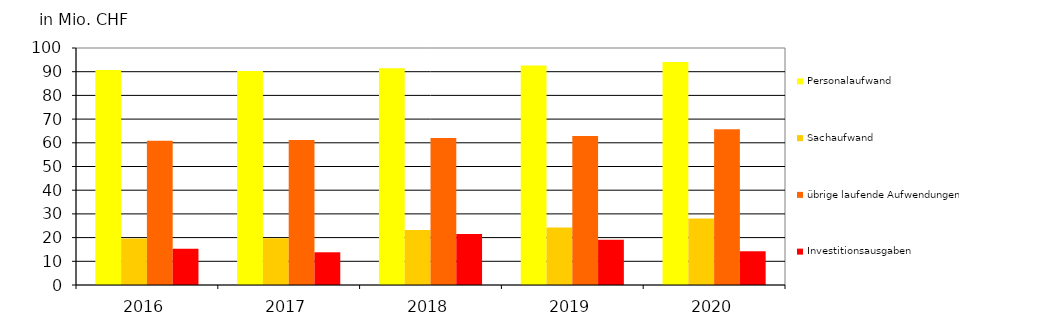
| Category | Personalaufwand
 | Sachaufwand
 | übrige laufende Aufwendungen | Investitionsausgaben
 |
|---|---|---|---|---|
| 2016.0 | 90.709 | 19.605 | 60.914 | 15.303 |
| 2017.0 | 90.267 | 19.68 | 61.136 | 13.805 |
| 2018.0 | 91.405 | 23.221 | 62.029 | 21.509 |
| 2019.0 | 92.583 | 24.252 | 62.865 | 19.142 |
| 2020.0 | 94.079 | 28.085 | 65.77 | 14.234 |